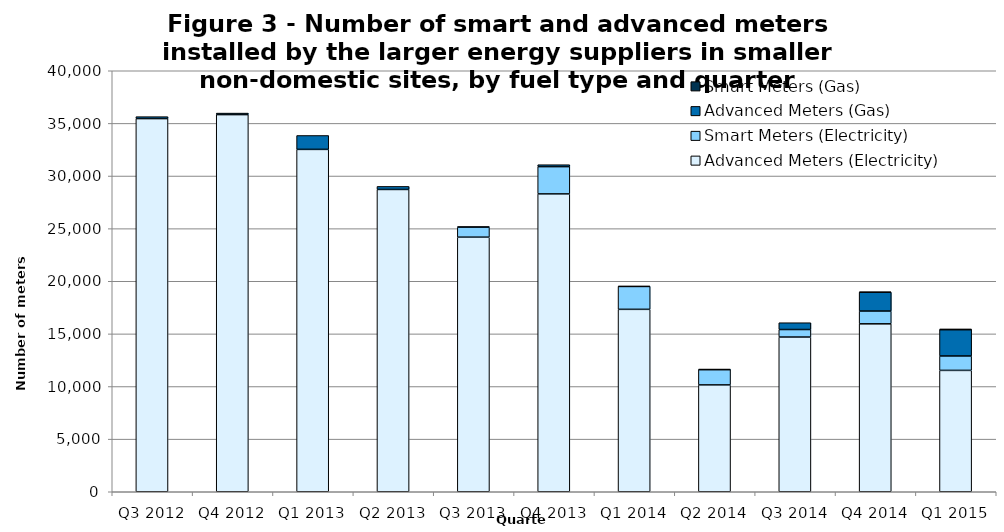
| Category | Advanced Meters (Electricity)  | Smart Meters (Electricity) | Advanced Meters (Gas) | Smart Meters (Gas) |
|---|---|---|---|---|
| Q3 2012 | 35455 | 0 | 186 | 0 |
| Q4 2012 | 35834 | 0 | 144 | 0 |
| Q1 2013 | 32529 | 0 | 1321 | 0 |
| Q2 2013 | 28722 | 0 | 290 | 0 |
| Q3 2013 | 24189 | 946 | 60 | 0 |
| Q4 2013 | 28300 | 2590 | 184 | 0 |
| Q1 2014 | 17332 | 2175 | 24 | 0 |
| Q2 2014 | 10152 | 1445 | 59 | 0 |
| Q3 2014 | 14700 | 714 | 647 | 0 |
| Q4 2014 | 15955 | 1214 | 1786 | 30 |
| Q1 2015 | 11531 | 1369 | 2497 | 72 |